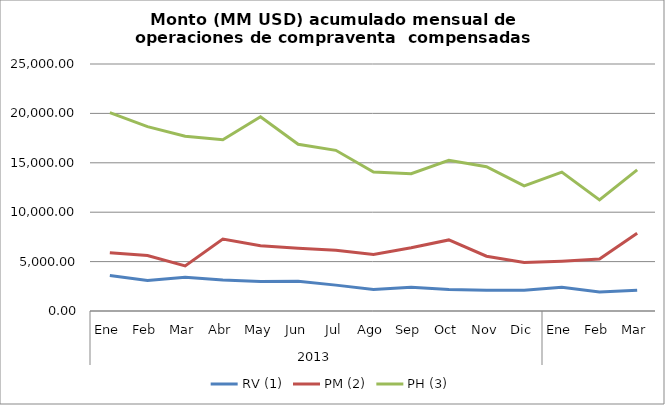
| Category | RV (1) | PM (2) | PH (3) |
|---|---|---|---|
| 0 | 3582.113 | 5901.651 | 20087.034 |
| 1 | 3086.223 | 5614.086 | 18662.914 |
| 2 | 3427.503 | 4559.027 | 17696.541 |
| 3 | 3146.302 | 7279.906 | 17332.385 |
| 4 | 2992.826 | 6596.857 | 19663.42 |
| 5 | 3012.804 | 6346.526 | 16878.408 |
| 6 | 2618.878 | 6139.885 | 16263.385 |
| 7 | 2182.732 | 5724.829 | 14069.305 |
| 8 | 2409.674 | 6399.577 | 13889.23 |
| 9 | 2180.079 | 7195.606 | 15254.774 |
| 10 | 2095.442 | 5541.836 | 14598.61 |
| 11 | 2104.88 | 4905.995 | 12657.524 |
| 12 | 2410.581 | 5047.1 | 14052.921 |
| 13 | 1913.3 | 5251.955 | 11240.27 |
| 14 | 2111.981 | 7861.413 | 14290.324 |